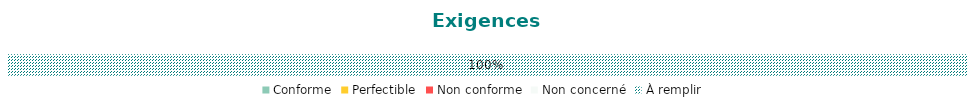
| Category | Conforme | Perfectible | Non conforme | Non concerné | À remplir |
|---|---|---|---|---|---|
| Général | 0 | 0 | 0 | 0 | 1 |